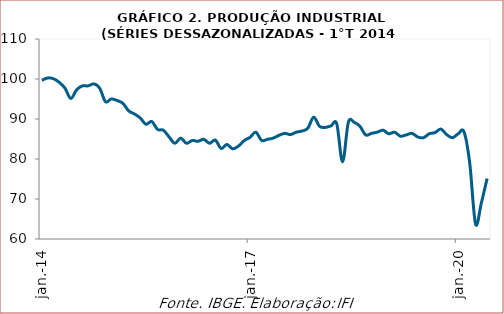
| Category | Produção industrial |
|---|---|
| 2014-01-01 | 99.67 |
| 2014-02-01 | 100.264 |
| 2014-03-01 | 100.066 |
| 2014-04-01 | 99.175 |
| 2014-05-01 | 97.691 |
| 2014-06-01 | 95.117 |
| 2014-07-01 | 97.295 |
| 2014-08-01 | 98.284 |
| 2014-09-01 | 98.284 |
| 2014-10-01 | 98.779 |
| 2014-11-01 | 97.691 |
| 2014-12-01 | 94.325 |
| 2015-01-01 | 95.018 |
| 2015-02-01 | 94.622 |
| 2015-03-01 | 93.929 |
| 2015-04-01 | 92.049 |
| 2015-05-01 | 91.257 |
| 2015-06-01 | 90.267 |
| 2015-07-01 | 88.684 |
| 2015-08-01 | 89.376 |
| 2015-09-01 | 87.397 |
| 2015-10-01 | 87.199 |
| 2015-11-01 | 85.516 |
| 2015-12-01 | 83.933 |
| 2016-01-01 | 85.219 |
| 2016-02-01 | 83.933 |
| 2016-03-01 | 84.626 |
| 2016-04-01 | 84.428 |
| 2016-05-01 | 84.922 |
| 2016-06-01 | 83.933 |
| 2016-07-01 | 84.725 |
| 2016-08-01 | 82.646 |
| 2016-09-01 | 83.636 |
| 2016-10-01 | 82.547 |
| 2016-11-01 | 83.24 |
| 2016-12-01 | 84.626 |
| 2017-01-01 | 85.417 |
| 2017-02-01 | 86.704 |
| 2017-03-01 | 84.626 |
| 2017-04-01 | 84.922 |
| 2017-05-01 | 85.219 |
| 2017-06-01 | 85.912 |
| 2017-07-01 | 86.407 |
| 2017-08-01 | 86.11 |
| 2017-09-01 | 86.704 |
| 2017-10-01 | 87.001 |
| 2017-11-01 | 87.694 |
| 2017-12-01 | 90.465 |
| 2018-01-01 | 88.189 |
| 2018-02-01 | 87.892 |
| 2018-03-01 | 88.288 |
| 2018-04-01 | 88.783 |
| 2018-05-01 | 79.281 |
| 2018-06-01 | 89.178 |
| 2018-07-01 | 89.178 |
| 2018-08-01 | 88.189 |
| 2018-09-01 | 86.011 |
| 2018-10-01 | 86.407 |
| 2018-11-01 | 86.704 |
| 2018-12-01 | 87.199 |
| 2019-01-01 | 86.308 |
| 2019-02-01 | 86.704 |
| 2019-03-01 | 85.714 |
| 2019-04-01 | 86.011 |
| 2019-05-01 | 86.407 |
| 2019-06-01 | 85.516 |
| 2019-07-01 | 85.318 |
| 2019-08-01 | 86.308 |
| 2019-09-01 | 86.605 |
| 2019-10-01 | 87.496 |
| 2019-11-01 | 86.11 |
| 2019-12-01 | 85.318 |
| 2020-01-01 | 86.308 |
| 2020-02-01 | 86.803 |
| 2020-03-01 | 78.885 |
| 2020-04-01 | 63.741 |
| 2020-05-01 | 68.987 |
| 2020-06-01 | 75.124 |